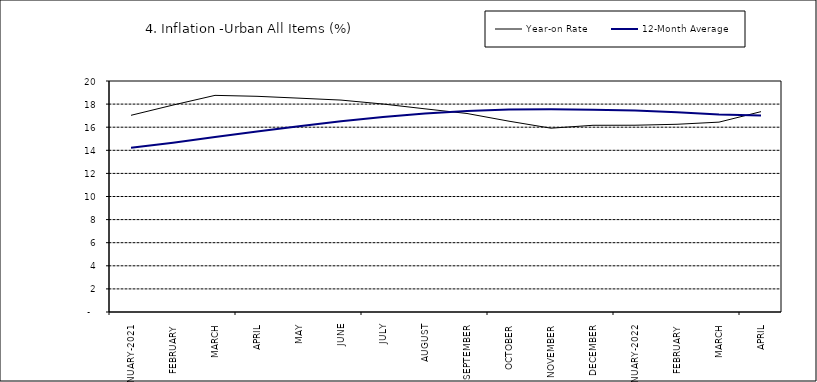
| Category | Year-on Rate | 12-Month Average |
|---|---|---|
| JANUARY-2021 | 17.03 | 14.228 |
| FEBRUARY | 17.918 | 14.66 |
| MARCH | 18.756 | 15.154 |
| APRIL | 18.675 | 15.63 |
| MAY | 18.514 | 16.086 |
| JUNE | 18.348 | 16.512 |
| JULY | 18.007 | 16.886 |
| AUGUST | 17.59 | 17.187 |
| SEPTEMBER | 17.187 | 17.411 |
| OCTOBER | 16.52 | 17.534 |
| NOVEMBER | 15.916 | 17.55 |
| DECEMBER | 16.165 | 17.519 |
| JANUARY-2022 | 16.171 | 17.435 |
| FEBRUARY | 16.253 | 17.292 |
| MARCH | 16.438 | 17.103 |
| APRIL | 17.347 | 17.005 |